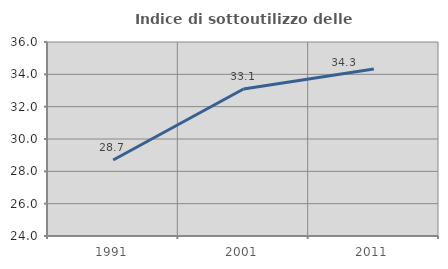
| Category | Indice di sottoutilizzo delle abitazioni  |
|---|---|
| 1991.0 | 28.7 |
| 2001.0 | 33.091 |
| 2011.0 | 34.329 |